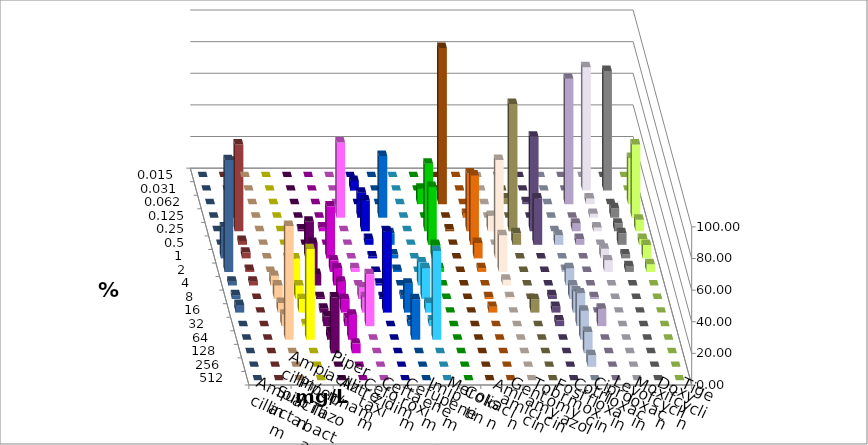
| Category | Ampicillin | Ampicillin/ Sulbactam | Piperacillin | Piperacillin/ Tazobactam | Aztreonam | Cefotaxim | Ceftazidim | Cefuroxim | Imipenem | Meropenem | Colistin | Amikacin | Gentamicin | Tobramycin | Fosfomycin | Cotrimoxazol | Ciprofloxacin | Levofloxacin | Moxifloxacin | Doxycyclin | Tigecyclin |
|---|---|---|---|---|---|---|---|---|---|---|---|---|---|---|---|---|---|---|---|---|---|
| 0.015 | 0 | 0 | 0 | 0 | 0 | 0 | 0 | 0 | 0 | 0 | 0 | 0 | 0 | 0 | 0 | 0 | 0 | 0 | 0 | 0 | 0 |
| 0.031 | 0 | 0 | 0 | 0 | 0 | 6.098 | 0 | 0 | 0 | 0 | 0 | 0 | 0 | 0 | 0 | 0 | 78.049 | 75.61 | 0 | 0 | 0 |
| 0.062 | 0 | 0 | 0 | 0 | 0 | 0 | 0 | 0 | 9.756 | 98.78 | 0 | 0 | 3.659 | 1.22 | 0 | 79.268 | 3.659 | 0 | 29.268 | 0 | 0 |
| 0.125 | 0 | 0 | 0 | 0 | 47.561 | 15.854 | 39.024 | 0 | 0 | 0 | 2.439 | 0 | 0 | 0 | 0 | 0 | 2.439 | 6.098 | 46.341 | 0 | 35.366 |
| 0.25 | 0 | 0 | 1.22 | 2.439 | 0 | 19.512 | 0 | 0 | 42.683 | 1.22 | 36.585 | 9.756 | 80.488 | 59.756 | 0 | 4.878 | 2.439 | 4.878 | 7.317 | 0 | 54.878 |
| 0.5 | 0 | 0 | 0 | 0 | 0 | 3.659 | 7.317 | 0 | 36.585 | 0 | 43.902 | 0 | 7.317 | 29.268 | 6.098 | 3.659 | 0 | 7.317 | 3.659 | 0 | 2.439 |
| 1.0 | 0 | 0 | 23.171 | 32.927 | 0 | 1.22 | 2.439 | 0 | 8.537 | 0 | 9.756 | 62.195 | 0 | 0 | 0 | 0 | 6.098 | 2.439 | 8.537 | 19.512 | 3.659 |
| 2.0 | 0 | 7.317 | 18.293 | 7.317 | 2.439 | 0 | 1.22 | 0 | 2.439 | 0 | 2.439 | 23.171 | 0 | 0 | 1.22 | 0 | 7.317 | 3.659 | 4.878 | 70.732 | 1.22 |
| 4.0 | 6.098 | 17.073 | 7.317 | 10.976 | 0 | 1.22 | 0 | 14.634 | 0 | 0 | 0 | 3.659 | 0 | 0 | 10.976 | 0 | 0 | 0 | 0 | 2.439 | 2.439 |
| 8.0 | 8.537 | 8.537 | 1.22 | 10.976 | 7.317 | 1.22 | 2.439 | 19.512 | 0 | 0 | 1.22 | 1.22 | 0 | 2.439 | 8.537 | 1.22 | 0 | 0 | 0 | 2.439 | 0 |
| 16.0 | 6.098 | 8.537 | 2.439 | 8.537 | 9.756 | 51.22 | 18.293 | 6.098 | 0 | 0 | 3.659 | 0 | 8.537 | 3.659 | 13.415 | 0 | 0 | 0 | 0 | 4.878 | 0 |
| 32.0 | 7.317 | 1.22 | 6.098 | 4.878 | 32.927 | 0 | 3.659 | 3.659 | 0 | 0 | 0 | 0 | 0 | 3.659 | 20.732 | 10.976 | 0 | 0 | 0 | 0 | 0 |
| 64.0 | 71.951 | 57.317 | 4.878 | 15.854 | 0 | 0 | 25.61 | 56.098 | 0 | 0 | 0 | 0 | 0 | 0 | 18.293 | 0 | 0 | 0 | 0 | 0 | 0 |
| 128.0 | 0 | 0 | 35.366 | 6.098 | 0 | 0 | 0 | 0 | 0 | 0 | 0 | 0 | 0 | 0 | 13.415 | 0 | 0 | 0 | 0 | 0 | 0 |
| 256.0 | 0 | 0 | 0 | 0 | 0 | 0 | 0 | 0 | 0 | 0 | 0 | 0 | 0 | 0 | 7.317 | 0 | 0 | 0 | 0 | 0 | 0 |
| 512.0 | 0 | 0 | 0 | 0 | 0 | 0 | 0 | 0 | 0 | 0 | 0 | 0 | 0 | 0 | 0 | 0 | 0 | 0 | 0 | 0 | 0 |